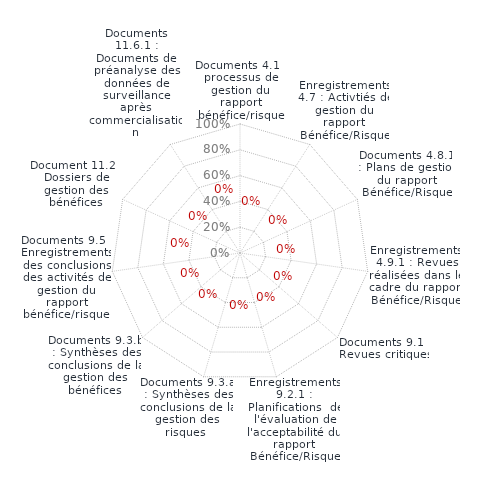
| Category | Series 0 |
|---|---|
| Documents 4.1 : processus de gestion du rapport bénéfice/risque | 0 |
| Enregistrements 4.7 : Activtiés de gestion du rapport Bénéfice/Risque | 0 |
| Documents 4.8.1 : Plans de gestion du rapport Bénéfice/Risque | 0 |
| Enregistrements 4.9.1 : Revues réalisées dans le cadre du rapport Bénéfice/Risque | 0 |
| Documents 9.1 : Revues critiques | 0 |
| Enregistrements 9.2.1 : Planifications  de l'évaluation de l'acceptabilité du rapport Bénéfice/Risque | 0 |
| Documents 9.3.a : Synthèses des conclusions de la gestion des risques  | 0 |
| Documents 9.3.b : Synthèses des conclusions de la gestion des bénéfices | 0 |
| Documents 9.5 : Enregistrements des conclusions des activités de gestion du rapport bénéfice/risque  | 0 |
| Document 11.2 : Dossiers de gestion des bénéfices | 0 |
| Documents 11.6.1 : Documents de préanalyse des données de surveillance après commercialisation | 0 |